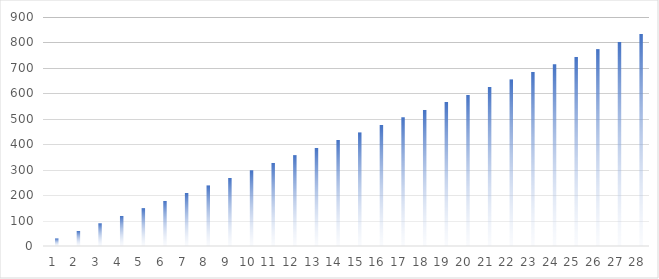
| Category | Wörter | Ziel |
|---|---|---|
| 0 | 0 | 29.762 |
| 1 | 0 | 59.524 |
| 2 | 0 | 89.286 |
| 3 | 0 | 119.048 |
| 4 | 0 | 148.81 |
| 5 | 0 | 178.571 |
| 6 | 0 | 208.333 |
| 7 | 0 | 238.095 |
| 8 | 0 | 267.857 |
| 9 | 0 | 297.619 |
| 10 | 0 | 327.381 |
| 11 | 0 | 357.143 |
| 12 | 0 | 386.905 |
| 13 | 0 | 416.667 |
| 14 | 0 | 446.429 |
| 15 | 0 | 476.19 |
| 16 | 0 | 505.952 |
| 17 | 0 | 535.714 |
| 18 | 0 | 565.476 |
| 19 | 0 | 595.238 |
| 20 | 0 | 625 |
| 21 | 0 | 654.762 |
| 22 | 0 | 684.524 |
| 23 | 0 | 714.286 |
| 24 | 0 | 744.048 |
| 25 | 0 | 773.81 |
| 26 | 0 | 803.571 |
| 27 | 0 | 833.333 |